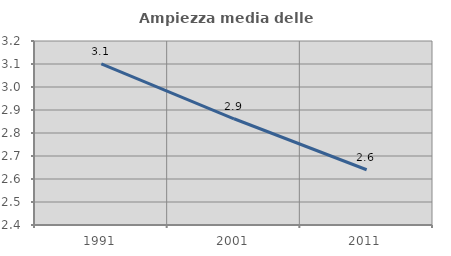
| Category | Ampiezza media delle famiglie |
|---|---|
| 1991.0 | 3.1 |
| 2001.0 | 2.862 |
| 2011.0 | 2.64 |